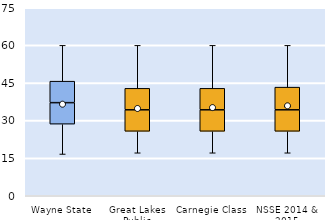
| Category | 25th | 50th | 75th |
|---|---|---|---|
| Wayne State | 28.571 | 8.571 | 8.571 |
| Great Lakes Public | 25.714 | 8.571 | 8.571 |
| Carnegie Class | 25.714 | 8.571 | 8.571 |
| NSSE 2014 & 2015 | 25.714 | 8.571 | 9.048 |